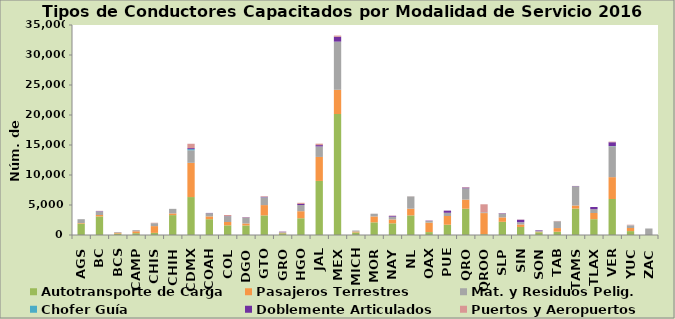
| Category | Autotransporte de Carga | Pasajeros Terrestres | Mat. y Residuos Pelig. | Chofer Guía | Doblemente Articulados | Puertos y Aeropuertos |
|---|---|---|---|---|---|---|
| AGS | 1906 | 95 | 633 | 0 | 0 | 0 |
| BC | 3099 | 234 | 586 | 8 | 56 | 41 |
| BCS | 239 | 136 | 111 | 0 | 0 | 17 |
| CAMP | 307 | 310 | 179 | 5 | 0 | 27 |
| CHIS | 352 | 1130 | 488 | 5 | 0 | 63 |
| CHIH | 3316 | 279 | 764 | 0 | 0 | 0 |
| CDMX | 6323 | 5705 | 2097 | 190 | 168 | 724 |
| COAH | 2634 | 465 | 539 | 0 | 41 | 0 |
| COL | 1613 | 551 | 973 | 0 | 24 | 177 |
| DGO | 1596 | 324 | 969 | 0 | 61 | 48 |
| GTO | 3268 | 1717 | 1277 | 21 | 84 | 98 |
| GRO | 286 | 93 | 103 | 0 | 66 | 27 |
| HGO | 2792 | 1174 | 1036 | 0 | 175 | 190 |
| JAL | 9011 | 3999 | 1749 | 0 | 225 | 238 |
| MEX | 20171 | 4030 | 8026 | 0 | 819 | 192 |
| MICH | 423 | 155 | 168 | 0 | 1 | 0 |
| MOR | 2113 | 978 | 453 | 0 | 5 | 7 |
| NAY | 1947 | 649 | 457 | 0 | 140 | 45 |
| NL | 3268 | 1118 | 2045 | 3 | 2 | 16 |
| OAX | 486 | 1580 | 270 | 0 | 57 | 12 |
| PUE | 1710 | 1461 | 534 | 0 | 357 | 11 |
| QRO | 4377 | 1524 | 1879 | 0 | 136 | 71 |
| QROO | 139 | 3515 | 136 | 0 | 0 | 1329 |
| SLP | 2197 | 742 | 617 | 0 | 72 | 29 |
| SIN | 1343 | 415 | 353 | 13 | 421 | 29 |
| SON | 452 | 81 | 167 | 0 | 92 | 9 |
| TAB | 548 | 609 | 1131 | 0 | 3 | 50 |
| TAMS | 4408 | 508 | 3203 | 0 | 44 | 16 |
| TLAX | 2634 | 1035 | 628 | 0 | 369 | 5 |
| VER | 5996 | 3646 | 5158 | 34 | 627 | 97 |
| YUC | 650 | 518 | 429 | 22 | 0 | 94 |
| ZAC | 0 | 0 | 1084 | 0 | 0 | 0 |